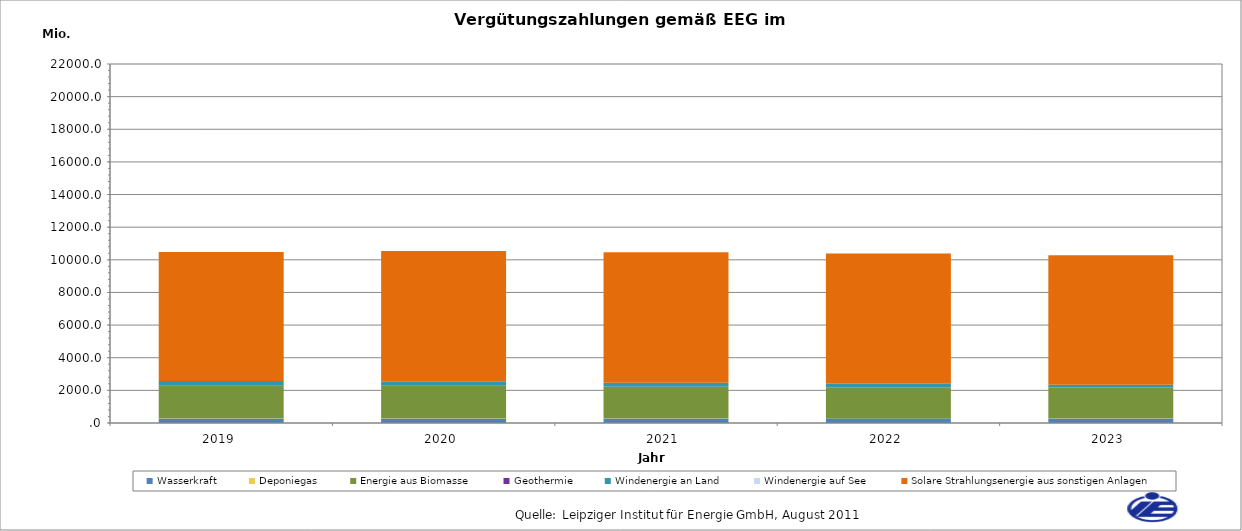
| Category | Wasserkraft | Deponiegas | Energie aus Biomasse | Geothermie | Windenergie an Land | Windenergie auf See | Solare Strahlungsenergie aus sonstigen Anlagen |
|---|---|---|---|---|---|---|---|
| 2019.0 | 262.257 | 11.75 | 1988.113 | 13.295 | 295.615 | 0 | 7914.194 |
| 2020.0 | 263.674 | 10.851 | 1994.3 | 13.331 | 276.01 | 0 | 7987.339 |
| 2021.0 | 263.603 | 5.529 | 1945.083 | 13.295 | 240.49 | 0 | 7998.718 |
| 2022.0 | 264.21 | 3.865 | 1912.387 | 13.295 | 204.007 | 0 | 7983.295 |
| 2023.0 | 264.815 | 3.365 | 1888.989 | 13.295 | 166.067 | 0 | 7940.529 |